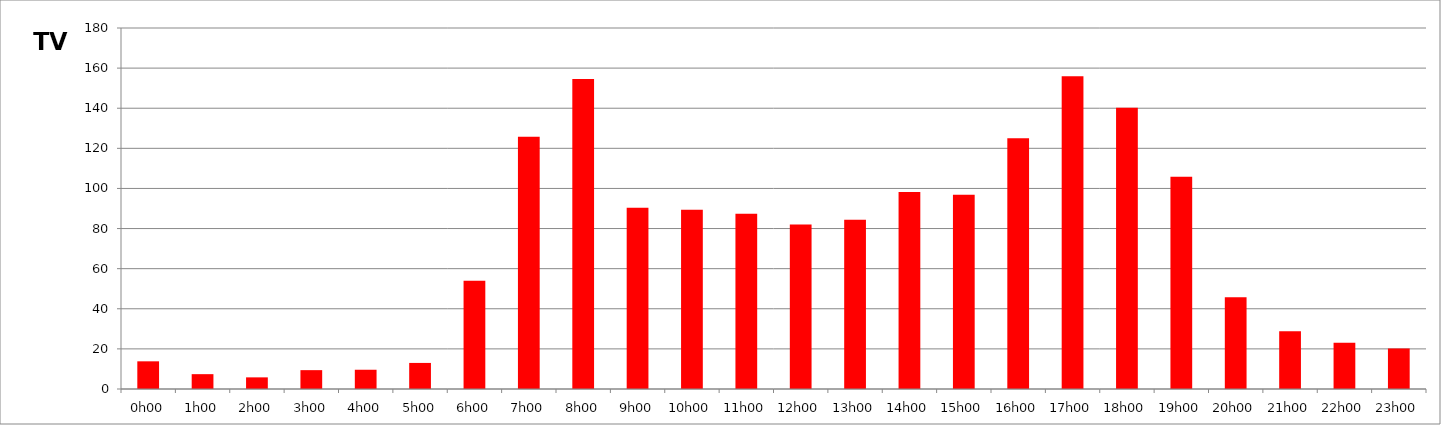
| Category | TV |
|---|---|
| 0.0 | 13.8 |
| 0.041666666666666664 | 7.4 |
| 0.08333333333333333 | 5.8 |
| 0.125 | 9.4 |
| 0.16666666666666666 | 9.6 |
| 0.20833333333333334 | 13 |
| 0.25 | 54 |
| 0.2916666666666667 | 125.8 |
| 0.3333333333333333 | 154.6 |
| 0.375 | 90.4 |
| 0.4166666666666667 | 89.4 |
| 0.4583333333333333 | 87.4 |
| 0.5 | 82 |
| 0.5416666666666666 | 84.4 |
| 0.5833333333333334 | 98.2 |
| 0.625 | 96.8 |
| 0.6666666666666666 | 125 |
| 0.7083333333333334 | 156 |
| 0.75 | 140.2 |
| 0.7916666666666666 | 105.8 |
| 0.8333333333333334 | 45.8 |
| 0.875 | 28.8 |
| 0.9166666666666666 | 23 |
| 0.9583333333333334 | 20.2 |